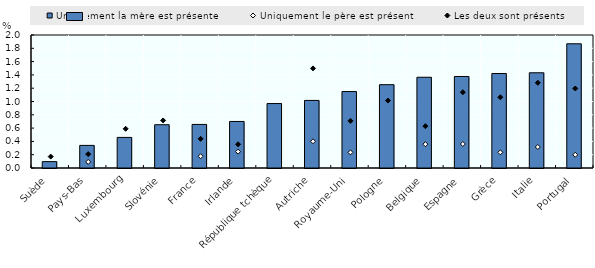
| Category | Uniquement la mère est présente |
|---|---|
| Suède | 0.096 |
| Pays-Bas | 0.34 |
| Luxembourg | 0.46 |
| Slovénie | 0.651 |
| France | 0.655 |
| Irlande | 0.7 |
| République tchèque | 0.969 |
| Autriche | 1.016 |
| Royaume-Uni | 1.15 |
| Pologne | 1.253 |
| Belgique | 1.365 |
| Espagne | 1.376 |
| Grèce | 1.421 |
| Italie | 1.432 |
| Portugal | 1.868 |